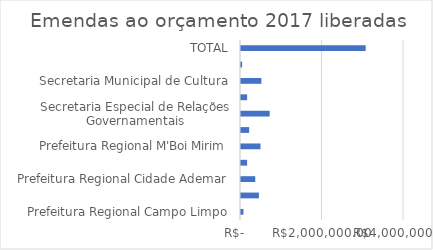
| Category | Series 0 |
|---|---|
| Prefeitura Regional Campo Limpo | 60000 |
| Prefeitura Regional Capela do Socorro | 440000 |
| Prefeitura Regional Cidade Ademar | 350000 |
| Prefeitura Regional Freguesia/Brasilândia | 150000 |
| Prefeitura Regional M'Boi Mirim | 478448 |
| Prefeitura Regional Santo Amaro | 200000 |
| Secretaria Especial de Relações Governamentais | 703662.46 |
| Secretaria Municipal das Prefeituras Regionais | 150000 |
| Secretaria Municipal de Cultura | 500000 |
| Secretaria Municipal de Esportes e Lazer | 27272 |
| TOTAL | 3059382.46 |